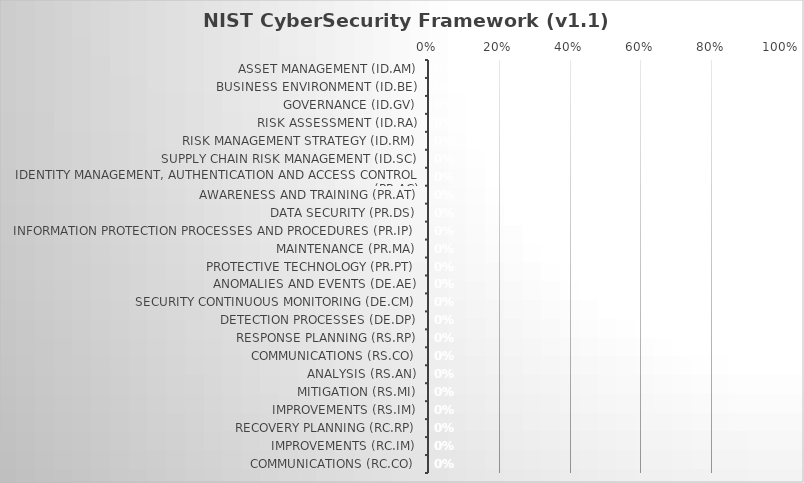
| Category | Implementation Score: |
|---|---|
| Asset Management (ID.AM) | 0 |
| Business Environment (ID.BE) | 0 |
| Governance (ID.GV) | 0 |
| Risk Assessment (ID.RA) | 0 |
| Risk Management Strategy (ID.RM) | 0 |
| Supply Chain Risk Management (ID.SC) | 0 |
| Identity Management, Authentication and Access Control (PR.AC) | 0 |
| Awareness and Training (PR.AT) | 0 |
| Data Security (PR.DS) | 0 |
| Information Protection Processes and Procedures (PR.IP) | 0 |
| Maintenance (PR.MA) | 0 |
| Protective Technology (PR.PT) | 0 |
| Anomalies and Events (DE.AE) | 0 |
| Security Continuous Monitoring (DE.CM) | 0 |
| Detection Processes (DE.DP) | 0 |
| Response Planning (RS.RP) | 0 |
| Communications (RS.CO) | 0 |
| Analysis (RS.AN) | 0 |
| Mitigation (RS.MI) | 0 |
| Improvements (RS.IM) | 0 |
| Recovery Planning (RC.RP) | 0 |
| Improvements (RC.IM) | 0 |
| Communications (RC.CO) | 0 |